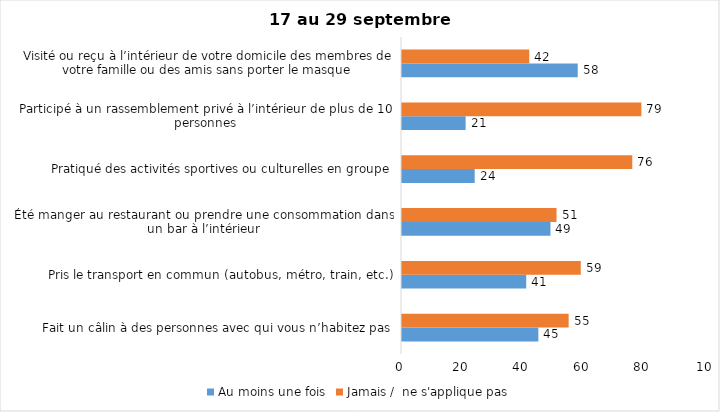
| Category | Au moins une fois | Jamais /  ne s'applique pas |
|---|---|---|
| Fait un câlin à des personnes avec qui vous n’habitez pas | 45 | 55 |
| Pris le transport en commun (autobus, métro, train, etc.) | 41 | 59 |
| Été manger au restaurant ou prendre une consommation dans un bar à l’intérieur | 49 | 51 |
| Pratiqué des activités sportives ou culturelles en groupe | 24 | 76 |
| Participé à un rassemblement privé à l’intérieur de plus de 10 personnes | 21 | 79 |
| Visité ou reçu à l’intérieur de votre domicile des membres de votre famille ou des amis sans porter le masque | 58 | 42 |